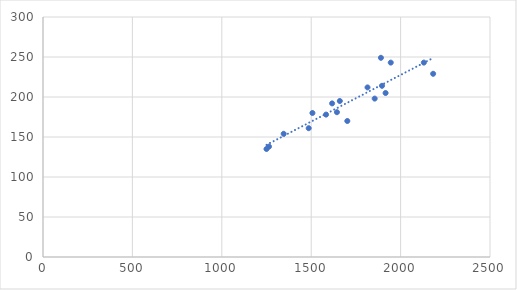
| Category | Advertising Amount |
|---|---|
| 1264.0 | 138 |
| 1250.0 | 135 |
| 1486.0 | 161 |
| 1896.0 | 214 |
| 2130.0 | 243 |
| 1660.0 | 195 |
| 1644.0 | 181 |
| 1346.0 | 154 |
| 1617.0 | 192 |
| 1507.0 | 180 |
| 1815.0 | 212 |
| 1702.0 | 170 |
| 2182.0 | 229 |
| 1855.0 | 198 |
| 1890.0 | 249 |
| 1945.0 | 243 |
| 1583.0 | 178 |
| 1916.0 | 205 |